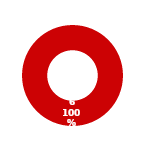
| Category | ACM |
|---|---|
| MIL 3 Complete | 0 |
| MIL 3 Not Complete | 6 |